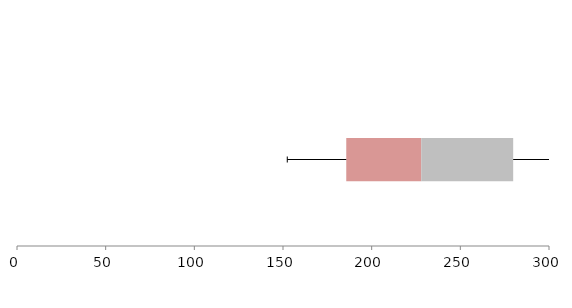
| Category | Series 1 | Series 2 | Series 3 |
|---|---|---|---|
| 0 | 185.673 | 42.292 | 51.836 |